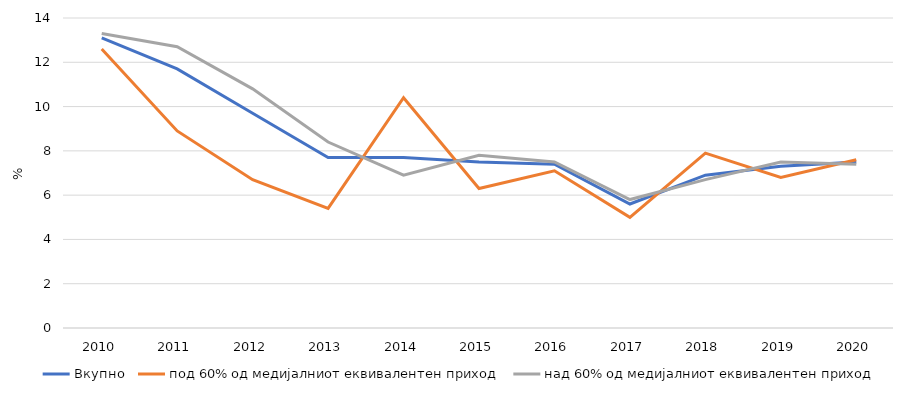
| Category | Вкупно  | под 60% од медијалниот еквивалентен приход | над 60% од медијалниот еквивалентен приход |
|---|---|---|---|
| 2010 | 13.1 | 12.6 | 13.3 |
| 2011 | 11.7 | 8.9 | 12.7 |
| 2012 | 9.7 | 6.7 | 10.8 |
| 2013 | 7.7 | 5.4 | 8.4 |
| 2014 | 7.7 | 10.4 | 6.9 |
| 2015 | 7.5 | 6.3 | 7.8 |
| 2016 | 7.4 | 7.1 | 7.5 |
| 2017 | 5.6 | 5 | 5.8 |
| 2018 | 6.9 | 7.9 | 6.7 |
| 2019 | 7.3 | 6.8 | 7.5 |
| 2020 | 7.5 | 7.6 | 7.4 |